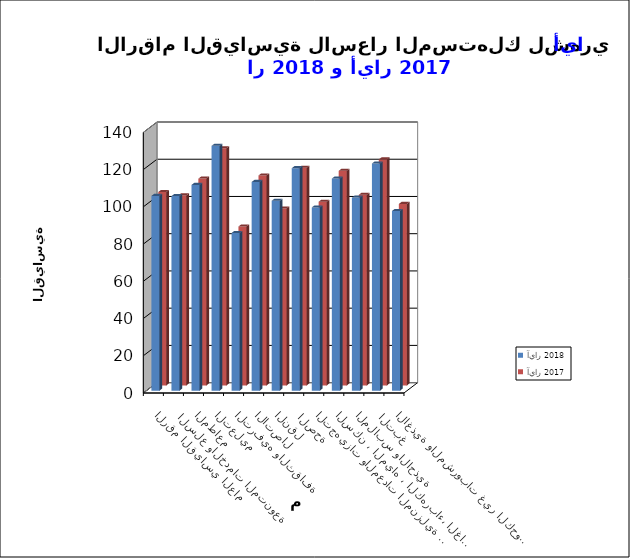
| Category | آيار 2018      | آيار 2017 |
|---|---|---|
| الاغذية والمشروبات غير الكحولية | 96.5 | 97.5 |
|  التبغ | 122 | 121.4 |
| الملابس والاحذية | 103.7 | 102.4 |
| السكن ، المياه ، الكهرباء، الغاز  | 113.9 | 115.3 |
| التجهيزات والمعدات المنزلية والصيانة | 98.4 | 98.7 |
|  الصحة | 119.5 | 116.9 |
| النقل | 102 | 95 |
| الاتصال | 112.1 | 112.8 |
| الترفيه والثقافة | 84.7 | 85.4 |
| التعليم | 131.5 | 127.4 |
| المطاعم  | 110.5 | 111.1 |
|  السلع والخدمات المتنوعة | 104.5 | 102.1 |
| الرقم القياسي العام | 104.6 | 103.9 |